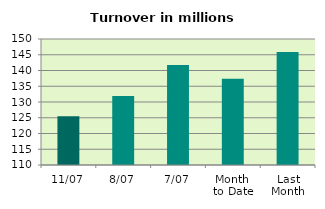
| Category | Series 0 |
|---|---|
| 11/07 | 125.467 |
| 8/07 | 131.871 |
| 7/07 | 141.715 |
| Month 
to Date | 137.368 |
| Last
Month | 145.879 |